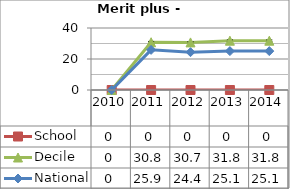
| Category | School  | Decile | National |
|---|---|---|---|
| 2010.0 | 0 | 0 | 0 |
| 2011.0 | 0 | 30.8 | 25.9 |
| 2012.0 | 0 | 30.7 | 24.4 |
| 2013.0 | 0 | 31.8 | 25.1 |
| 2014.0 | 0 | 31.8 | 25.1 |